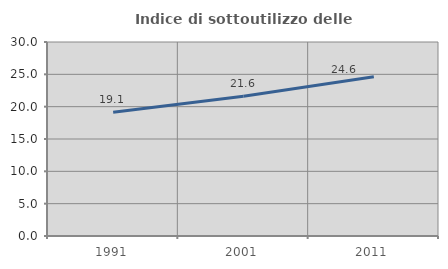
| Category | Indice di sottoutilizzo delle abitazioni  |
|---|---|
| 1991.0 | 19.132 |
| 2001.0 | 21.62 |
| 2011.0 | 24.633 |